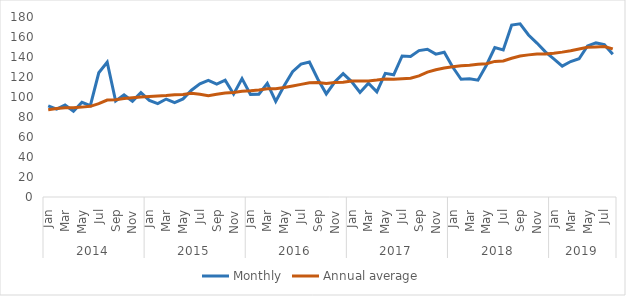
| Category | Monthly | Annual average |
|---|---|---|
| 0 | 91.172 | 87.258 |
| 1 | 87.795 | 88.6 |
| 2 | 91.925 | 89.367 |
| 3 | 85.793 | 89.314 |
| 4 | 94.702 | 89.879 |
| 5 | 91.375 | 90.649 |
| 6 | 124.243 | 93.285 |
| 7 | 134.751 | 96.991 |
| 8 | 96.05 | 97.232 |
| 9 | 102.032 | 98.524 |
| 10 | 95.842 | 99.319 |
| 11 | 104.32 | 100 |
| 12 | 96.525 | 100.446 |
| 13 | 93.393 | 100.913 |
| 14 | 97.959 | 101.415 |
| 15 | 94.356 | 102.129 |
| 16 | 98.093 | 102.412 |
| 17 | 106.814 | 103.698 |
| 18 | 113.212 | 102.779 |
| 19 | 116.54 | 101.261 |
| 20 | 112.953 | 102.67 |
| 21 | 116.784 | 103.899 |
| 22 | 102.901 | 104.488 |
| 23 | 118.434 | 105.664 |
| 24 | 102.639 | 106.173 |
| 25 | 102.81 | 106.958 |
| 26 | 113.562 | 108.258 |
| 27 | 95.519 | 108.355 |
| 28 | 111.187 | 109.446 |
| 29 | 125.368 | 110.992 |
| 30 | 132.853 | 112.629 |
| 31 | 135.013 | 114.169 |
| 32 | 117.791 | 114.572 |
| 33 | 103.136 | 113.434 |
| 34 | 114.985 | 114.441 |
| 35 | 123.408 | 114.856 |
| 36 | 115.412 | 115.92 |
| 37 | 104.485 | 116.06 |
| 38 | 113.825 | 116.082 |
| 39 | 105.211 | 116.89 |
| 40 | 123.659 | 117.929 |
| 41 | 122.192 | 117.664 |
| 42 | 140.996 | 118.343 |
| 43 | 140.454 | 118.796 |
| 44 | 146.37 | 121.178 |
| 45 | 147.791 | 124.899 |
| 46 | 142.845 | 127.221 |
| 47 | 144.734 | 128.998 |
| 48 | 129.971 | 130.211 |
| 49 | 117.721 | 131.314 |
| 50 | 118.31 | 131.688 |
| 51 | 116.791 | 132.653 |
| 52 | 131.732 | 133.326 |
| 53 | 149.357 | 135.589 |
| 54 | 147.046 | 136.094 |
| 55 | 171.905 | 138.714 |
| 56 | 173.192 | 140.95 |
| 57 | 161.986 | 142.132 |
| 58 | 153.917 | 143.055 |
| 59 | 145.117 | 143.087 |
| 60 | 138.119 | 143.766 |
| 61 | 130.858 | 144.861 |
| 62 | 135.482 | 146.292 |
| 63 | 138.236 | 148.079 |
| 64 | 151.054 | 149.689 |
| 65 | 154.087 | 150.083 |
| 66 | 152.354 | 150.526 |
| 67 | 142.661 | 148.089 |